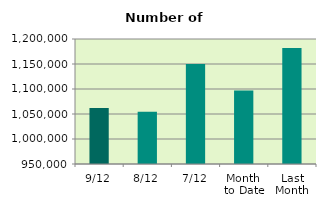
| Category | Series 0 |
|---|---|
| 9/12 | 1062172 |
| 8/12 | 1054538 |
| 7/12 | 1150132 |
| Month 
to Date | 1097203.143 |
| Last
Month | 1182027.273 |